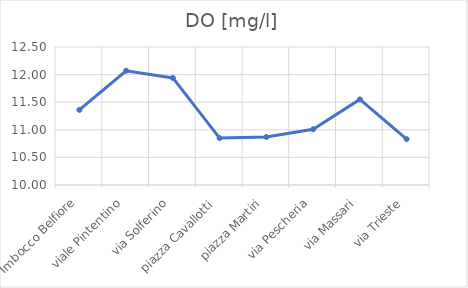
| Category | DO [mg/l] |
|---|---|
| Imbocco Belfiore | 11.36 |
| viale Pintentino | 12.07 |
| via Solferino | 11.94 |
| piazza Cavallotti | 10.85 |
| piazza Martiri | 10.87 |
| via Pescheria | 11.01 |
| via Massari | 11.55 |
| via Trieste | 10.83 |